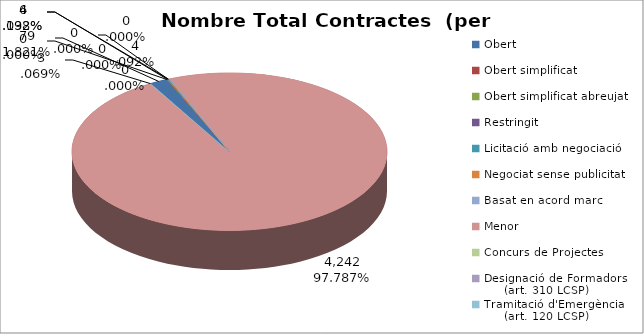
| Category | Nombre Total Contractes |
|---|---|
| Obert | 79 |
| Obert simplificat | 0 |
| Obert simplificat abreujat | 6 |
| Restringit | 0 |
| Licitació amb negociació | 0 |
| Negociat sense publicitat | 4 |
| Basat en acord marc | 4 |
| Menor | 4242 |
| Concurs de Projectes | 0 |
| Designació de Formadors
     (art. 310 LCSP) | 3 |
| Tramitació d'Emergència
     (art. 120 LCSP) | 0 |